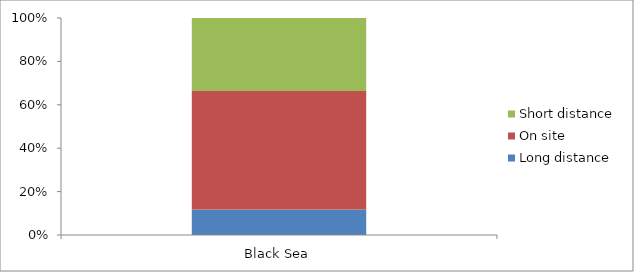
| Category | Long distance | On site | Short distance |
|---|---|---|---|
| Black Sea | 4334.25 | 20224.25 | 12433.5 |